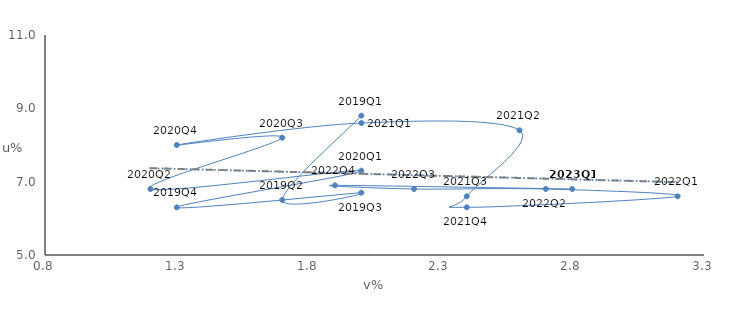
| Category | Unemployment and Vacancy Rate Percentage |
|---|---|
| 2.0 | 8.8 |
| 1.7 | 6.5 |
| 2.0 | 6.7 |
| 1.3 | 6.3 |
| 2.0 | 7.3 |
| 1.2 | 6.8 |
| 1.7 | 8.2 |
| 1.3 | 8 |
| 2.0 | 8.6 |
| 2.6 | 8.4 |
| 2.4 | 6.6 |
| 2.4 | 6.3 |
| 3.2 | 6.6 |
| 2.7 | 6.8 |
| 2.2 | 6.8 |
| 1.9 | 6.9 |
| 2.8 | 6.8 |